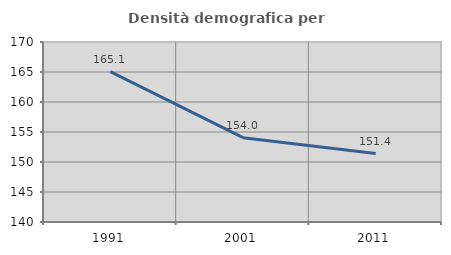
| Category | Densità demografica |
|---|---|
| 1991.0 | 165.064 |
| 2001.0 | 154.048 |
| 2011.0 | 151.408 |